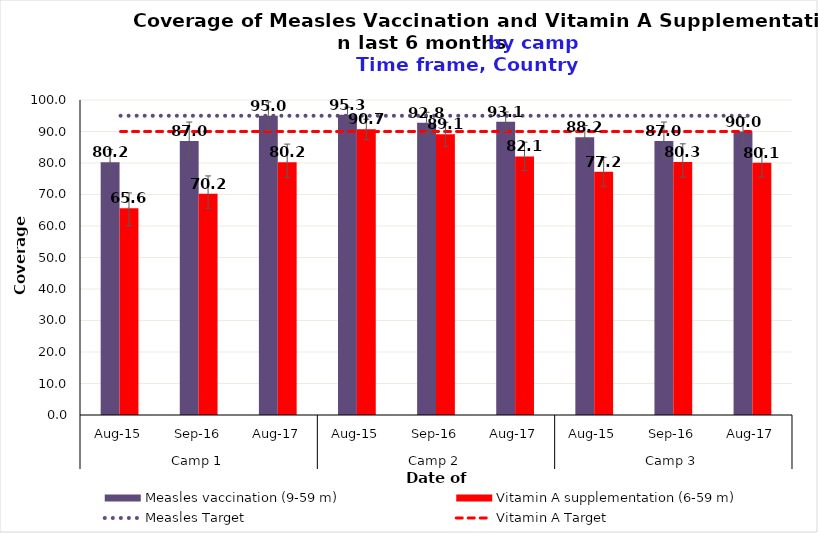
| Category | Measles vaccination (9-59 m) | Vitamin A supplementation (6-59 m) |
|---|---|---|
| 0 | 80.2 | 65.6 |
| 1 | 87 | 70.2 |
| 2 | 95 | 80.2 |
| 3 | 95.3 | 90.7 |
| 4 | 92.8 | 89.1 |
| 5 | 93.1 | 82.1 |
| 6 | 88.2 | 77.2 |
| 7 | 87 | 80.3 |
| 8 | 90 | 80.1 |